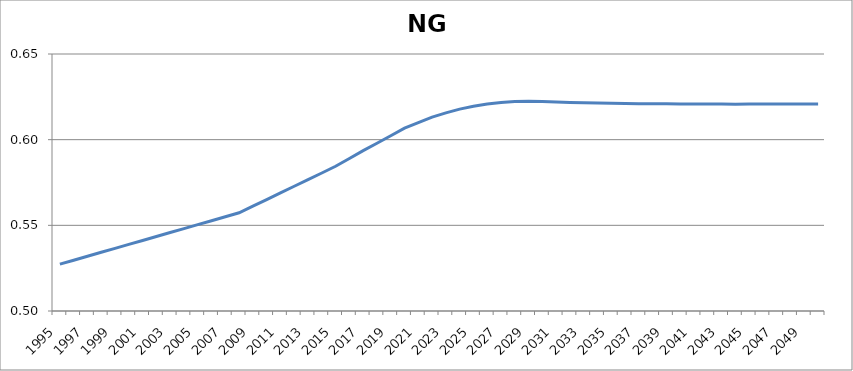
| Category | NGDryer |
|---|---|
| 1995.0 | 0.527 |
| 1996.0 | 0.53 |
| 1997.0 | 0.532 |
| 1998.0 | 0.534 |
| 1999.0 | 0.537 |
| 2000.0 | 0.539 |
| 2001.0 | 0.541 |
| 2002.0 | 0.543 |
| 2003.0 | 0.546 |
| 2004.0 | 0.548 |
| 2005.0 | 0.55 |
| 2006.0 | 0.553 |
| 2007.0 | 0.555 |
| 2008.0 | 0.557 |
| 2009.0 | 0.561 |
| 2010.0 | 0.565 |
| 2011.0 | 0.569 |
| 2012.0 | 0.573 |
| 2013.0 | 0.577 |
| 2014.0 | 0.581 |
| 2015.0 | 0.584 |
| 2016.0 | 0.589 |
| 2017.0 | 0.594 |
| 2018.0 | 0.598 |
| 2019.0 | 0.602 |
| 2020.0 | 0.607 |
| 2021.0 | 0.61 |
| 2022.0 | 0.613 |
| 2023.0 | 0.616 |
| 2024.0 | 0.618 |
| 2025.0 | 0.619 |
| 2026.0 | 0.621 |
| 2027.0 | 0.622 |
| 2028.0 | 0.622 |
| 2029.0 | 0.622 |
| 2030.0 | 0.622 |
| 2031.0 | 0.622 |
| 2032.0 | 0.622 |
| 2033.0 | 0.622 |
| 2034.0 | 0.621 |
| 2035.0 | 0.621 |
| 2036.0 | 0.621 |
| 2037.0 | 0.621 |
| 2038.0 | 0.621 |
| 2039.0 | 0.621 |
| 2040.0 | 0.621 |
| 2041.0 | 0.621 |
| 2042.0 | 0.621 |
| 2043.0 | 0.621 |
| 2044.0 | 0.621 |
| 2045.0 | 0.621 |
| 2046.0 | 0.621 |
| 2047.0 | 0.621 |
| 2048.0 | 0.621 |
| 2049.0 | 0.621 |
| 2050.0 | 0.621 |